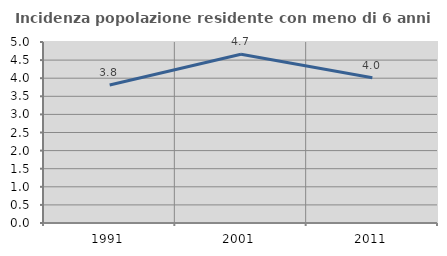
| Category | Incidenza popolazione residente con meno di 6 anni |
|---|---|
| 1991.0 | 3.814 |
| 2001.0 | 4.662 |
| 2011.0 | 4.011 |